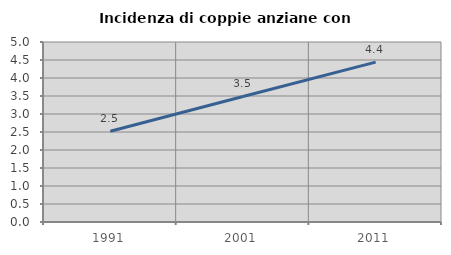
| Category | Incidenza di coppie anziane con figli |
|---|---|
| 1991.0 | 2.52 |
| 2001.0 | 3.488 |
| 2011.0 | 4.441 |